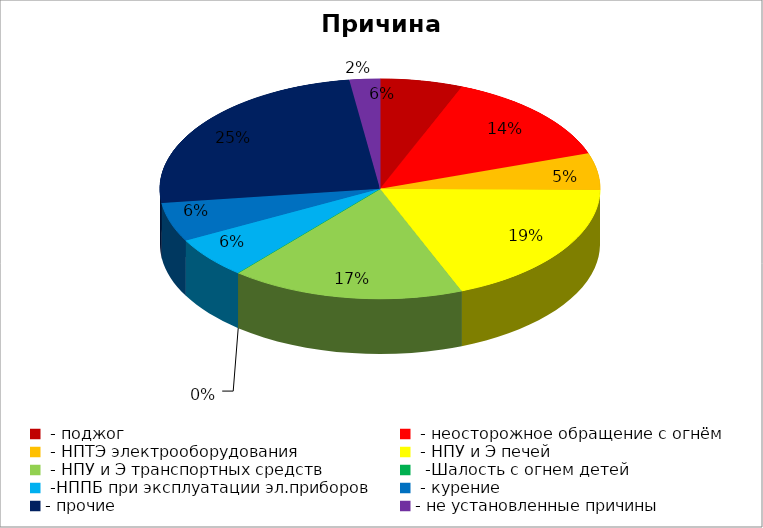
| Category | Причина пожара |
|---|---|
|  - поджог | 19 |
|  - неосторожное обращение с огнём | 43 |
|  - НПТЭ электрооборудования | 17 |
|  - НПУ и Э печей | 59 |
|  - НПУ и Э транспортных средств | 54 |
|   -Шалость с огнем детей | 0 |
|  -НППБ при эксплуатации эл.приборов | 19 |
|  - курение | 18 |
| - прочие | 78 |
| - не установленные причины | 7 |